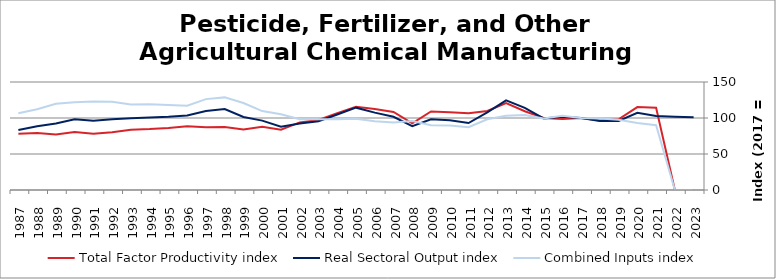
| Category | Total Factor Productivity index | Real Sectoral Output index | Combined Inputs index |
|---|---|---|---|
| 2023.0 | 0 | 101.052 | 0 |
| 2022.0 | 0 | 101.76 | 0 |
| 2021.0 | 114.323 | 102.856 | 89.97 |
| 2020.0 | 115.177 | 107.273 | 93.138 |
| 2019.0 | 98.2 | 95.924 | 97.683 |
| 2018.0 | 96.675 | 95.894 | 99.192 |
| 2017.0 | 100 | 100 | 100 |
| 2016.0 | 98.762 | 101.871 | 103.148 |
| 2015.0 | 100.15 | 99.391 | 99.243 |
| 2014.0 | 109.391 | 114.102 | 104.307 |
| 2013.0 | 120.783 | 124.468 | 103.051 |
| 2012.0 | 109.686 | 107.781 | 98.263 |
| 2011.0 | 106.691 | 93.016 | 87.183 |
| 2010.0 | 108.125 | 97.032 | 89.741 |
| 2009.0 | 109.045 | 98.122 | 89.983 |
| 2008.0 | 92.62 | 88.688 | 95.755 |
| 2007.0 | 108.424 | 101.699 | 93.797 |
| 2006.0 | 112.56 | 107.474 | 95.481 |
| 2005.0 | 115.716 | 114.347 | 98.817 |
| 2004.0 | 106.574 | 104.804 | 98.339 |
| 2003.0 | 97.314 | 95.602 | 98.242 |
| 2002.0 | 93.937 | 92.437 | 98.403 |
| 2001.0 | 83.628 | 87.962 | 105.182 |
| 2000.0 | 87.851 | 96.335 | 109.657 |
| 1999.0 | 83.882 | 101.339 | 120.811 |
| 1998.0 | 87.369 | 112.383 | 128.631 |
| 1997.0 | 87.011 | 109.825 | 126.22 |
| 1996.0 | 88.374 | 103.378 | 116.977 |
| 1995.0 | 86.202 | 101.726 | 118.009 |
| 1994.0 | 84.622 | 100.676 | 118.971 |
| 1993.0 | 83.798 | 99.489 | 118.724 |
| 1992.0 | 80.222 | 98.328 | 122.571 |
| 1991.0 | 78.024 | 96.014 | 123.057 |
| 1990.0 | 80.585 | 98.131 | 121.773 |
| 1989.0 | 77.112 | 92.258 | 119.642 |
| 1988.0 | 79.072 | 88.607 | 112.059 |
| 1987.0 | 78.176 | 83.333 | 106.597 |